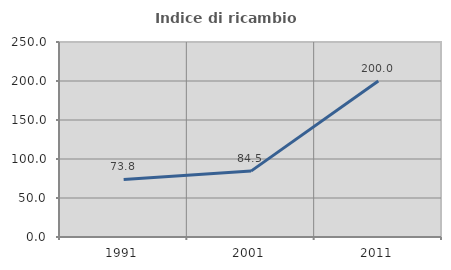
| Category | Indice di ricambio occupazionale  |
|---|---|
| 1991.0 | 73.81 |
| 2001.0 | 84.466 |
| 2011.0 | 200 |